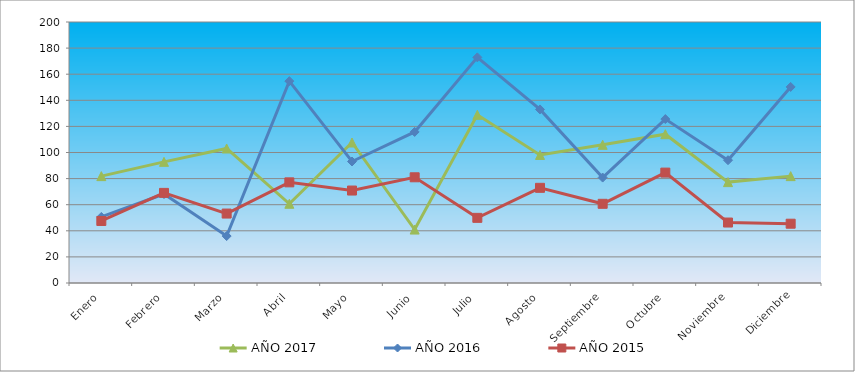
| Category | AÑO 2017 | AÑO 2016 | AÑO 2015 |
|---|---|---|---|
| Enero | 81.896 | 50.633 | 47.53 |
| Febrero | 92.839 | 68.17 | 69.053 |
| Marzo | 103.076 | 35.961 | 53.21 |
| Abril | 60.716 | 154.683 | 77.124 |
| Mayo | 107.665 | 93.106 | 70.847 |
| Junio | 40.948 | 115.766 | 81.01 |
| Julio | 128.844 | 172.911 | 49.922 |
| Agosto | 98.134 | 133.008 | 72.939 |
| Septiembre | 105.9 | 80.79 | 60.683 |
| Octubre | 114.019 | 125.619 | 84.598 |
| Noviembre | 77.307 | 94.091 | 46.334 |
| Diciembre | 81.896 | 150.25 | 45.438 |